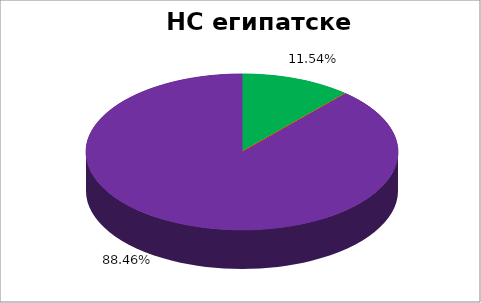
| Category | НС египатске НМ |
|---|---|
| 0 | 0.115 |
| 1 | 0 |
| 2 | 0 |
| 3 | 0 |
| 4 | 0.885 |